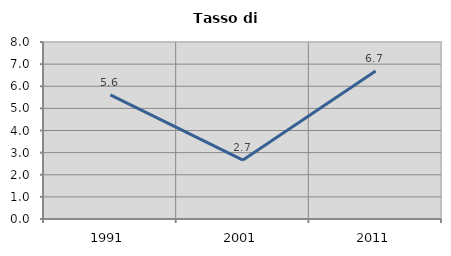
| Category | Tasso di disoccupazione   |
|---|---|
| 1991.0 | 5.613 |
| 2001.0 | 2.664 |
| 2011.0 | 6.694 |